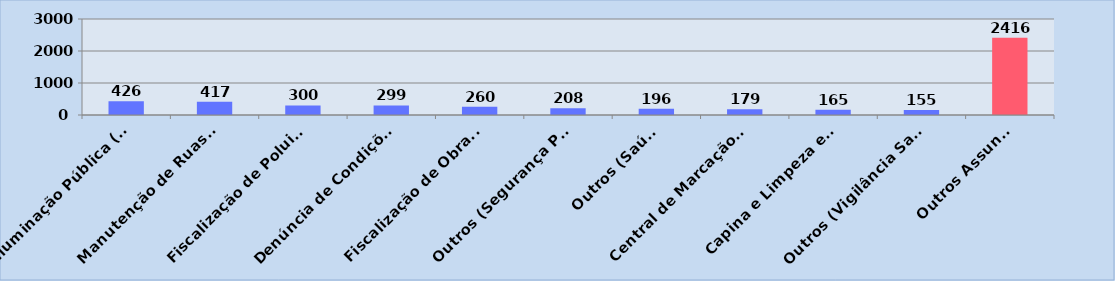
| Category | Series 0 |
|---|---|
| Iluminação Pública (Obras e Serviços Públicos) | 426 |
| Manutenção de Ruas (Obras e Serviços Públicos) | 417 |
| Fiscalização de Poluição Sonora (Meio Ambiente) | 300 |
| Denúncia de Condições Inadequadas de Criação (COPBEA) | 299 |
| Fiscalização de Obras Irregulares (Planejamento) | 260 |
| Outros (Segurança Pública) | 208 |
| Outros (Saúde) | 196 |
| Central de Marcação de Consultas (Saúde) | 179 |
| Capina e Limpeza em Vias Públicas (Obras e Serviços Públicos) | 165 |
| Outros (Vigilância Sanitária) | 155 |
| Outros Assuntos | 2416 |